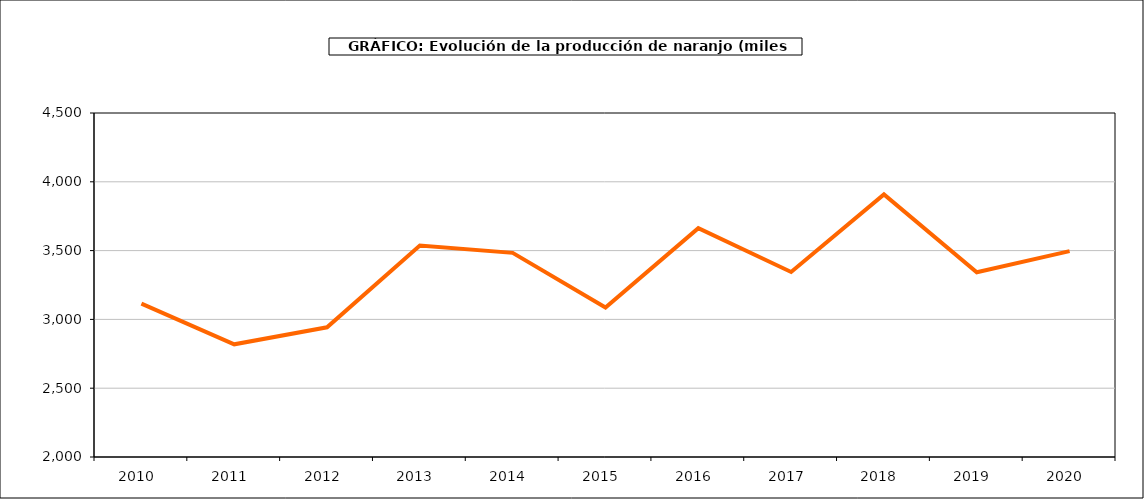
| Category | producción |
|---|---|
| 2010.0 | 3114.808 |
| 2011.0 | 2818.888 |
| 2012.0 | 2942.28 |
| 2013.0 | 3536.745 |
| 2014.0 | 3483.503 |
| 2015.0 | 3086.849 |
| 2016.0 | 3662.718 |
| 2017.0 | 3344.428 |
| 2018.0 | 3908.749 |
| 2019.0 | 3342.54 |
| 2020.0 | 3496.145 |